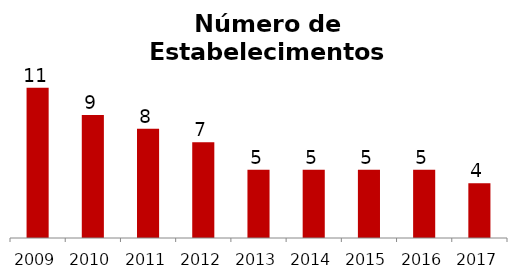
| Category | Cultura e Lazer |
|---|---|
| 2009.0 | 11 |
| 2010.0 | 9 |
| 2011.0 | 8 |
| 2012.0 | 7 |
| 2013.0 | 5 |
| 2014.0 | 5 |
| 2015.0 | 5 |
| 2016.0 | 5 |
| 2017.0 | 4 |